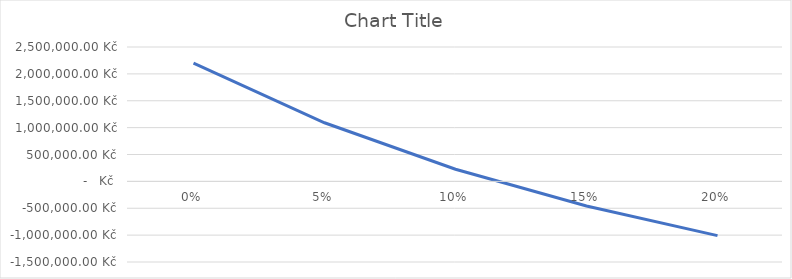
| Category | Series 0 |
|---|---|
| 0.0 | 2200000 |
| 0.05 | 1090830.481 |
| 0.1 | 226312.839 |
| 0.15 | -458620.767 |
| 0.2 | -1009387.86 |